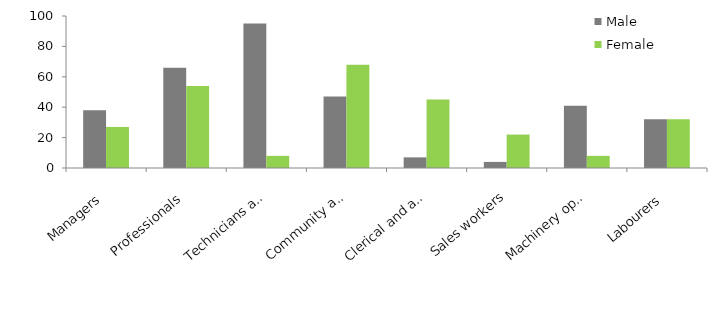
| Category | Male | Female |
|---|---|---|
| Managers | 38 | 27 |
| Professionals | 66 | 54 |
| Technicians and trades workers | 95 | 8 |
| Community and personal service workers | 47 | 68 |
| Clerical and administrative workers | 7 | 45 |
| Sales workers | 4 | 22 |
| Machinery operators and drivers | 41 | 8 |
| Labourers | 32 | 32 |